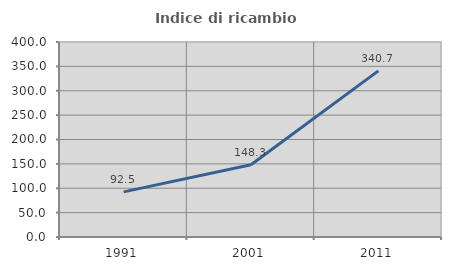
| Category | Indice di ricambio occupazionale  |
|---|---|
| 1991.0 | 92.527 |
| 2001.0 | 148.254 |
| 2011.0 | 340.741 |